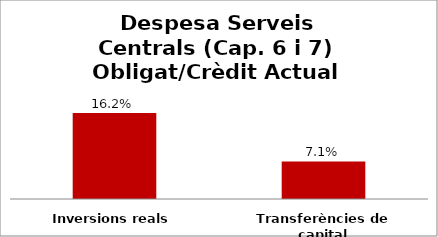
| Category | Series 0 |
|---|---|
| Inversions reals | 0.162 |
| Transferències de capital | 0.071 |